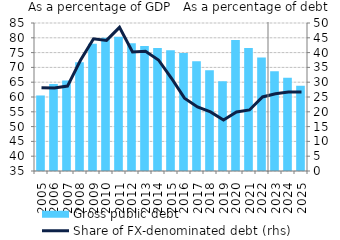
| Category | Gross public debt |
|---|---|
| 2005.0 | 60.518 |
| 2006.0 | 64.427 |
| 2007.0 | 65.55 |
| 2008.0 | 71.757 |
| 2009.0 | 78.032 |
| 2010.0 | 80.007 |
| 2011.0 | 80.338 |
| 2012.0 | 78.155 |
| 2013.0 | 77.198 |
| 2014.0 | 76.542 |
| 2015.0 | 75.76 |
| 2016.0 | 74.85 |
| 2017.0 | 72.114 |
| 2018.0 | 69.078 |
| 2019.0 | 65.333 |
| 2020.0 | 79.253 |
| 2021.0 | 76.591 |
| 2022.0 | 73.307 |
| 2023.0 | 68.739 |
| 2024.0 | 66.468 |
| 2025.0 | 63.808 |